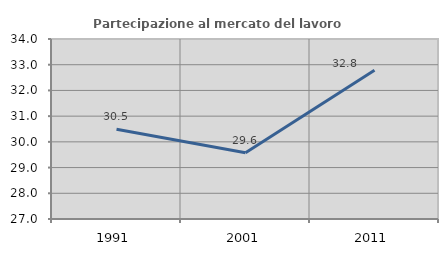
| Category | Partecipazione al mercato del lavoro  femminile |
|---|---|
| 1991.0 | 30.488 |
| 2001.0 | 29.577 |
| 2011.0 | 32.787 |